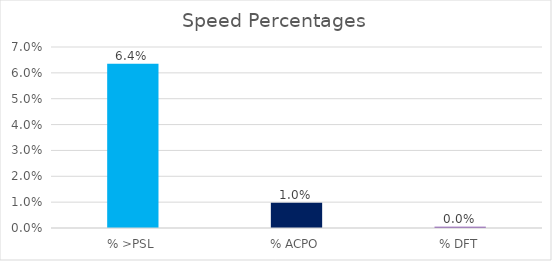
| Category | Series 0 |
|---|---|
| % >PSL | 0.064 |
| % ACPO | 0.01 |
| % DFT | 0 |